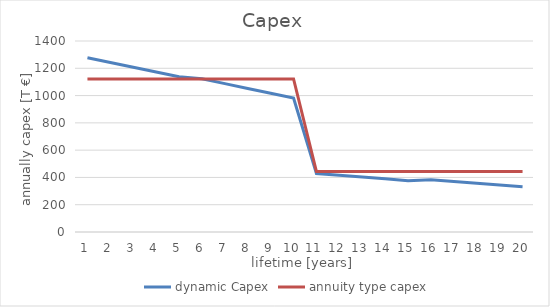
| Category | dynamic Capex | annuity type capex |
|---|---|---|
| 0 | 1277.5 | 1121.65 |
| 1 | 1242.5 | 1121.65 |
| 2 | 1207.5 | 1121.65 |
| 3 | 1172.5 | 1121.65 |
| 4 | 1137.5 | 1121.65 |
| 5 | 1122.5 | 1121.65 |
| 6 | 1087.5 | 1121.65 |
| 7 | 1052.5 | 1121.65 |
| 8 | 1017.5 | 1121.65 |
| 9 | 982.5 | 1121.65 |
| 10 | 428.5 | 443.5 |
| 11 | 415.5 | 443.5 |
| 12 | 402.5 | 443.5 |
| 13 | 389.5 | 443.5 |
| 14 | 376.5 | 443.5 |
| 15 | 383.5 | 443.5 |
| 16 | 370.5 | 443.5 |
| 17 | 357.5 | 443.5 |
| 18 | 344.5 | 443.5 |
| 19 | 331.5 | 443.5 |